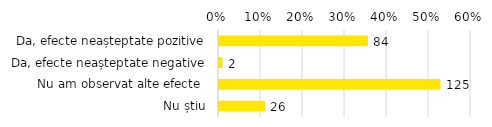
| Category | Series 0 |
|---|---|
| Da, efecte neașteptate pozitive | 0.354 |
| Da, efecte neașteptate negative | 0.008 |
| Nu am observat alte efecte  | 0.527 |
| Nu știu | 0.11 |